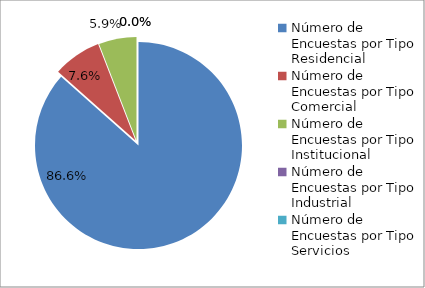
| Category | Series 0 |
|---|---|
| 0 | 103 |
| 1 | 9 |
| 2 | 7 |
| 3 | 0 |
| 4 | 0 |